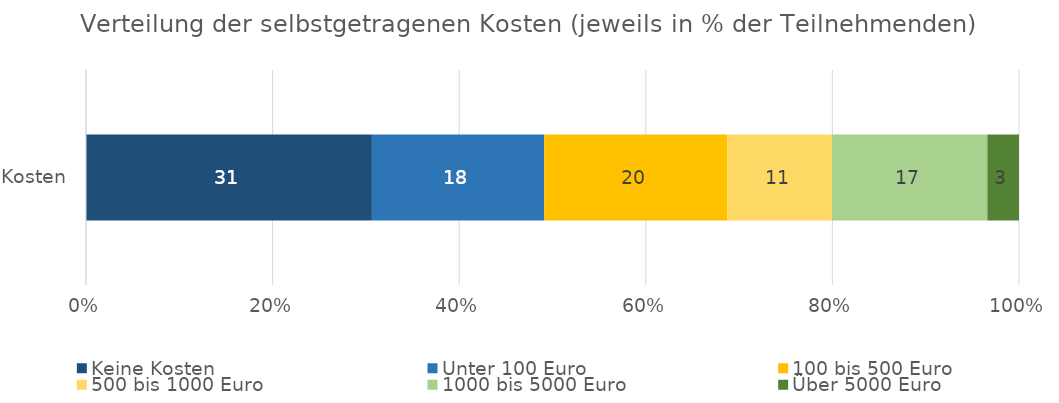
| Category | Keine Kosten | Unter 100 Euro | 100 bis 500 Euro | 500 bis 1000 Euro | 1000 bis 5000 Euro | Über 5000 Euro |
|---|---|---|---|---|---|---|
| Kosten | 30.64 | 18.47 | 19.63 | 11.21 | 16.65 | 3.39 |